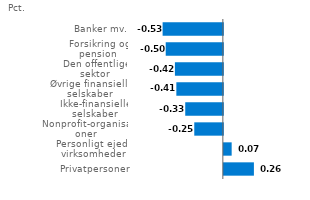
| Category | Series 0 |
|---|---|
| Privatpersoner | 0.265 |
| Personligt ejede virksomheder | 0.069 |
| Nonprofit-organisationer | -0.252 |
| Ikke-finansielle selskaber | -0.331 |
| Øvrige finansielle selskaber | -0.409 |
| Den offentlige sektor | -0.422 |
| Forsikring og pension  | -0.503 |
| Banker mv. | -0.531 |